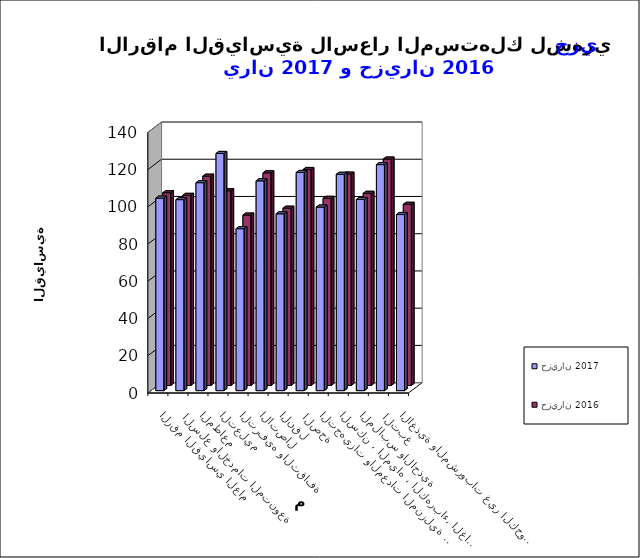
| Category | حزيران 2017      | حزيران 2016 |
|---|---|---|
| الاغذية والمشروبات غير الكحولية | 94.6 | 97.3 |
|  التبغ | 121.4 | 121.6 |
| الملابس والاحذية | 102.7 | 103.2 |
| السكن ، المياه ، الكهرباء، الغاز  | 116.2 | 113.5 |
| التجهيزات والمعدات المنزلية والصيانة | 98.6 | 100.5 |
|  الصحة | 117.2 | 116 |
| النقل | 95 | 95.2 |
| الاتصال | 112.7 | 114.2 |
| الترفيه والثقافة | 87 | 91.5 |
| التعليم | 127.4 | 104.6 |
| المطاعم  | 111.7 | 112.4 |
|  السلع والخدمات المتنوعة | 102.6 | 102.1 |
| الرقم القياسي العام | 103.4 | 103.5 |